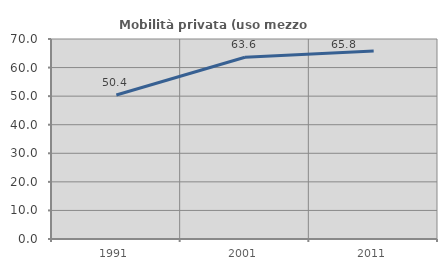
| Category | Mobilità privata (uso mezzo privato) |
|---|---|
| 1991.0 | 50.378 |
| 2001.0 | 63.616 |
| 2011.0 | 65.772 |